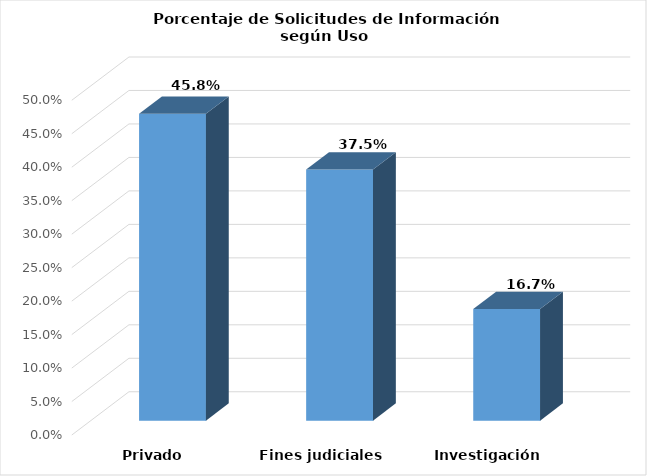
| Category | Series 0 |
|---|---|
| Privado | 0.458 |
| Fines judiciales | 0.375 |
| Investigación | 0.167 |